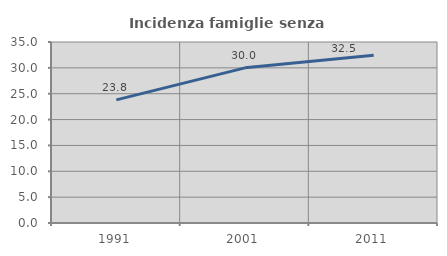
| Category | Incidenza famiglie senza nuclei |
|---|---|
| 1991.0 | 23.81 |
| 2001.0 | 30 |
| 2011.0 | 32.455 |